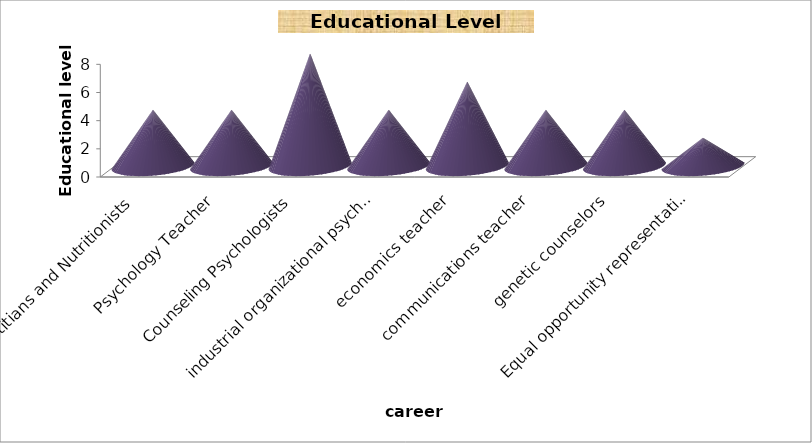
| Category | No. of years after Highschool |
|---|---|
| Dietitians and Nutritionists | 4 |
| Psychology Teacher | 4 |
| Counseling Psychologists | 8 |
| industrial organizational psychologists | 4 |
| economics teacher | 6 |
| communications teacher | 4 |
| genetic counselors | 4 |
| Equal opportunity representatives and officers  | 2 |